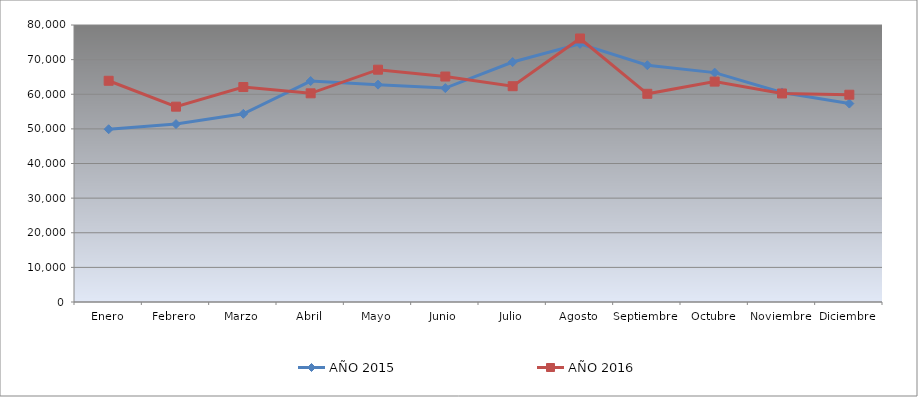
| Category | AÑO 2015 | AÑO 2016 |
|---|---|---|
| Enero | 49895.521 | 63893.643 |
| Febrero | 51384.414 | 56416.493 |
| Marzo | 54345.926 | 62081.586 |
| Abril | 63813.546 | 60269.528 |
| Mayo | 62772.135 | 67093.014 |
| Junio | 61774.116 | 65118.23 |
| Julio | 69302.65 | 62321.538 |
| Agosto | 74553.097 | 76106.414 |
| Septiembre | 68391.415 | 60131.624 |
| Octubre | 66248.929 | 63650.932 |
| Noviembre | 60526.592 | 60225.399 |
| Diciembre | 57310.151 | 59866.849 |